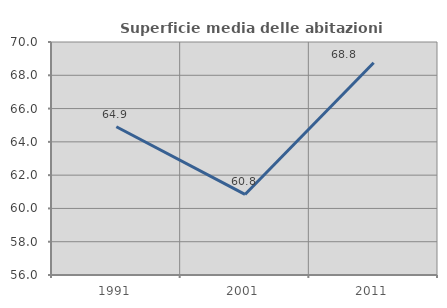
| Category | Superficie media delle abitazioni occupate |
|---|---|
| 1991.0 | 64.91 |
| 2001.0 | 60.841 |
| 2011.0 | 68.752 |